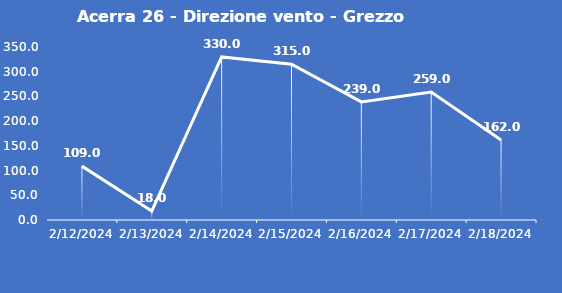
| Category | Acerra 26 - Direzione vento - Grezzo (°N) |
|---|---|
| 2/12/24 | 109 |
| 2/13/24 | 18 |
| 2/14/24 | 330 |
| 2/15/24 | 315 |
| 2/16/24 | 239 |
| 2/17/24 | 259 |
| 2/18/24 | 162 |